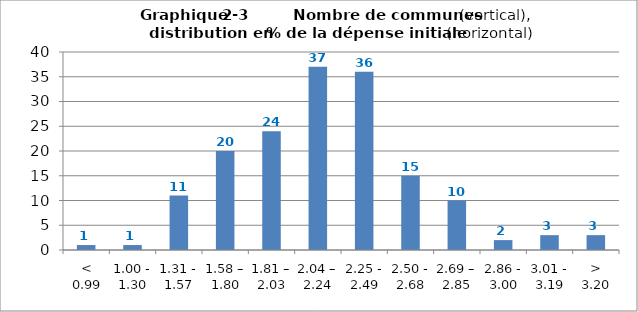
| Category | en % de la dépense initiale |
|---|---|
| < 0.99 | 1 |
| 1.00 - 1.30 | 1 |
| 1.31 - 1.57 | 11 |
| 1.58 – 1.80 | 20 |
| 1.81 – 2.03 | 24 |
| 2.04 – 2.24 | 37 |
| 2.25 - 2.49 | 36 |
| 2.50 - 2.68 | 15 |
| 2.69 – 2.85 | 10 |
| 2.86 - 3.00 | 2 |
| 3.01 - 3.19 | 3 |
| > 3.20 | 3 |